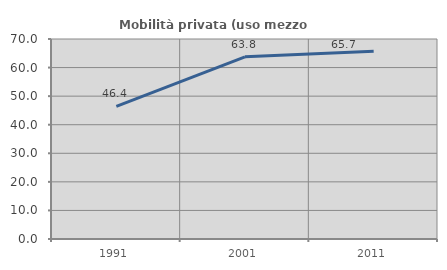
| Category | Mobilità privata (uso mezzo privato) |
|---|---|
| 1991.0 | 46.392 |
| 2001.0 | 63.761 |
| 2011.0 | 65.714 |